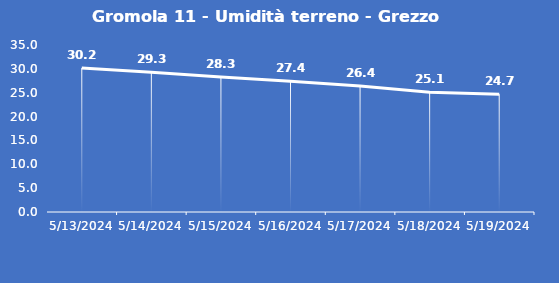
| Category | Gromola 11 - Umidità terreno - Grezzo (%VWC) |
|---|---|
| 5/13/24 | 30.2 |
| 5/14/24 | 29.3 |
| 5/15/24 | 28.3 |
| 5/16/24 | 27.4 |
| 5/17/24 | 26.4 |
| 5/18/24 | 25.1 |
| 5/19/24 | 24.7 |